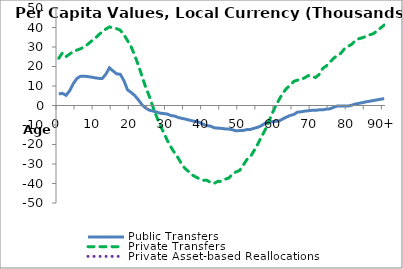
| Category | Public Transfers | Private Transfers | Private Asset-based Reallocations | Public Asset-based Reallocations |
|---|---|---|---|---|
| 0 | 5962.554 | 24219.385 |  |  |
|  | 6233.535 | 27001.633 |  |  |
| 2 | 5216.643 | 25081.131 |  |  |
| 3 | 7558.255 | 26373.823 |  |  |
| 4 | 11175.115 | 27689.099 |  |  |
| 5 | 13853.176 | 28393.296 |  |  |
| 6 | 14988.252 | 29079.438 |  |  |
| 7 | 15020.287 | 30121.116 |  |  |
| 8 | 14827.967 | 31368.519 |  |  |
| 9 | 14557.679 | 33013.113 |  |  |
| 10 | 14207.767 | 34377.362 |  |  |
| 11 | 13914.339 | 36244.128 |  |  |
| 12 | 13830.359 | 37722.302 |  |  |
| 13 | 16016.11 | 39189.806 |  |  |
| 14 | 19313.304 | 40294.143 |  |  |
| 15 | 17706.232 | 39752.811 |  |  |
| 16 | 16214.673 | 39412.932 |  |  |
| 17 | 16031.922 | 38612.082 |  |  |
| 18 | 12798.301 | 36295.847 |  |  |
| 19 | 8054.959 | 33307.872 |  |  |
| 20 | 6695.969 | 30167.441 |  |  |
| 21 | 5122.64 | 25710.63 |  |  |
| 22 | 2916.591 | 20681.091 |  |  |
| 23 | 429.282 | 15066.876 |  |  |
| 24 | -1297.286 | 9524.773 |  |  |
| 25 | -2361.409 | 4863.579 |  |  |
| 26 | -2853.559 | -505.584 |  |  |
| 27 | -3272.662 | -5439.065 |  |  |
| 28 | -3937.409 | -10091.109 |  |  |
| 29 | -4141.276 | -13806.141 |  |  |
| 30 | -4371.936 | -17840.421 |  |  |
| 31 | -5167.047 | -21275.864 |  |  |
| 32 | -5398.989 | -24244.322 |  |  |
| 33 | -6145.414 | -26858.121 |  |  |
| 34 | -6574.548 | -30165.205 |  |  |
| 35 | -6962.643 | -32431.188 |  |  |
| 36 | -7472.524 | -34011.56 |  |  |
| 37 | -7896.613 | -35727.114 |  |  |
| 38 | -8285.822 | -36747.467 |  |  |
| 39 | -8699.322 | -37679.909 |  |  |
| 40 | -9679.039 | -38397.97 |  |  |
| 41 | -10325.917 | -38359.881 |  |  |
| 42 | -10602.454 | -39530.655 |  |  |
| 43 | -11428.539 | -39906.999 |  |  |
| 44 | -11606.51 | -38886.587 |  |  |
| 45 | -11742.241 | -38942.755 |  |  |
| 46 | -12004.559 | -37826.776 |  |  |
| 47 | -12064.739 | -37216.945 |  |  |
| 48 | -12460.598 | -35229.893 |  |  |
| 49 | -13004.756 | -34073.079 |  |  |
| 50 | -12863.128 | -33307.289 |  |  |
| 51 | -12799.991 | -30668.565 |  |  |
| 52 | -12352.324 | -27745.936 |  |  |
| 53 | -12264.219 | -26184.577 |  |  |
| 54 | -11675.284 | -23190.106 |  |  |
| 55 | -11202.695 | -19955.282 |  |  |
| 56 | -10371.592 | -16242.902 |  |  |
| 57 | -9178.577 | -12801.153 |  |  |
| 58 | -8264.397 | -8778.487 |  |  |
| 59 | -8292.86 | -4047.407 |  |  |
| 60 | -8115.593 | -234.553 |  |  |
| 61 | -7869.324 | 3262.823 |  |  |
| 62 | -6861.418 | 6455.065 |  |  |
| 63 | -5931.944 | 8777.166 |  |  |
| 64 | -5090.38 | 10356.671 |  |  |
| 65 | -4589.676 | 12372.302 |  |  |
| 66 | -3415.588 | 13007.498 |  |  |
| 67 | -3221.039 | 13259.963 |  |  |
| 68 | -2887.569 | 14217.724 |  |  |
| 69 | -2709.497 | 15327.946 |  |  |
| 70 | -2464.457 | 15012.32 |  |  |
| 71 | -2472.918 | 14327.24 |  |  |
| 72 | -2246.038 | 15921.095 |  |  |
| 73 | -2189.59 | 19020.361 |  |  |
| 74 | -1883.925 | 20277.44 |  |  |
| 75 | -1690.555 | 22248.721 |  |  |
| 76 | -939.067 | 24213.669 |  |  |
| 77 | -283.501 | 25544.633 |  |  |
| 78 | -280.786 | 26750.48 |  |  |
| 79 | -191.28 | 29081.504 |  |  |
| 80 | -286.71 | 30309.152 |  |  |
| 81 | 116.727 | 31376.158 |  |  |
| 82 | 740.864 | 33258.499 |  |  |
| 83 | 1080.115 | 34263.473 |  |  |
| 84 | 1457.113 | 34745.342 |  |  |
| 85 | 1888.68 | 35482.38 |  |  |
| 86 | 2220.009 | 36244.757 |  |  |
| 87 | 2551.198 | 36822.606 |  |  |
| 88 | 2882.388 | 38296.664 |  |  |
| 89 | 3213.577 | 39770.723 |  |  |
| 90+ | 3544.766 | 41245.747 |  |  |